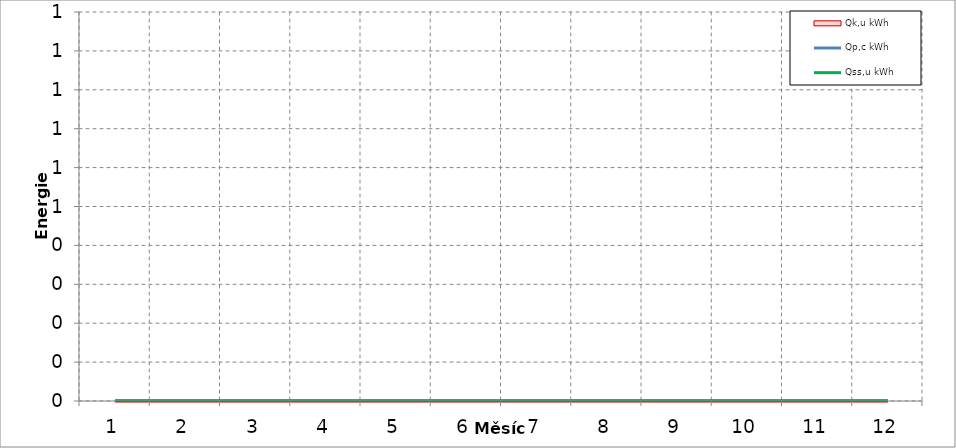
| Category | Qp,c | Qss,u |
|---|---|---|
| 1.0 | 0 | 0 |
| 2.0 | 0 | 0 |
| 3.0 | 0 | 0 |
| 4.0 | 0 | 0 |
| 5.0 | 0 | 0 |
| 6.0 | 0 | 0 |
| 7.0 | 0 | 0 |
| 8.0 | 0 | 0 |
| 9.0 | 0 | 0 |
| 10.0 | 0 | 0 |
| 11.0 | 0 | 0 |
| 12.0 | 0 | 0 |